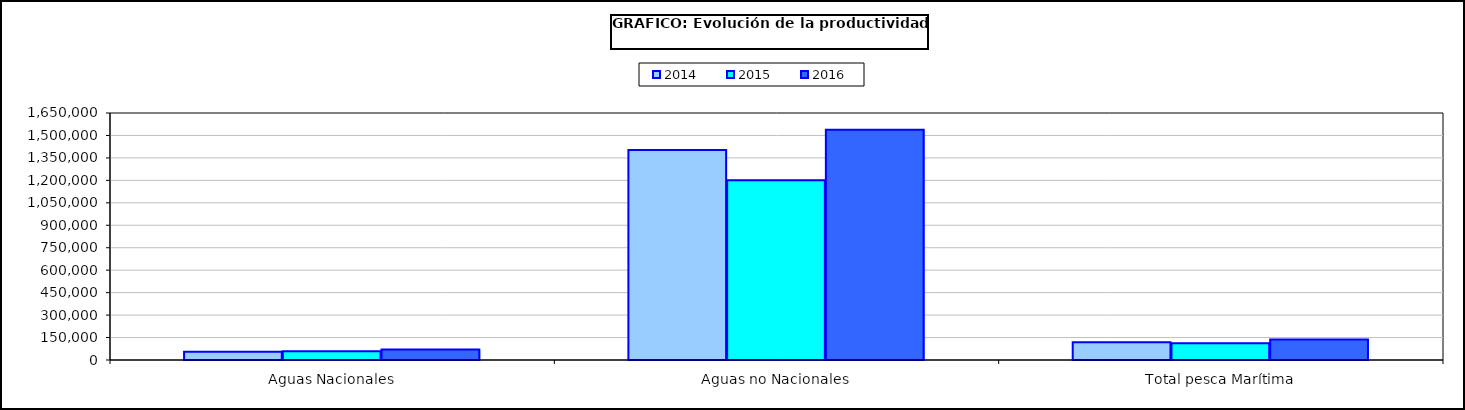
| Category | 2014 | 2015 | 2016 |
|---|---|---|---|
| 0 | 54780.687 | 58558.794 | 69511.518 |
| 1 | 1402056.645 | 1201114.948 | 1538868.762 |
| 2 | 119254.033 | 112588.623 | 136700.226 |